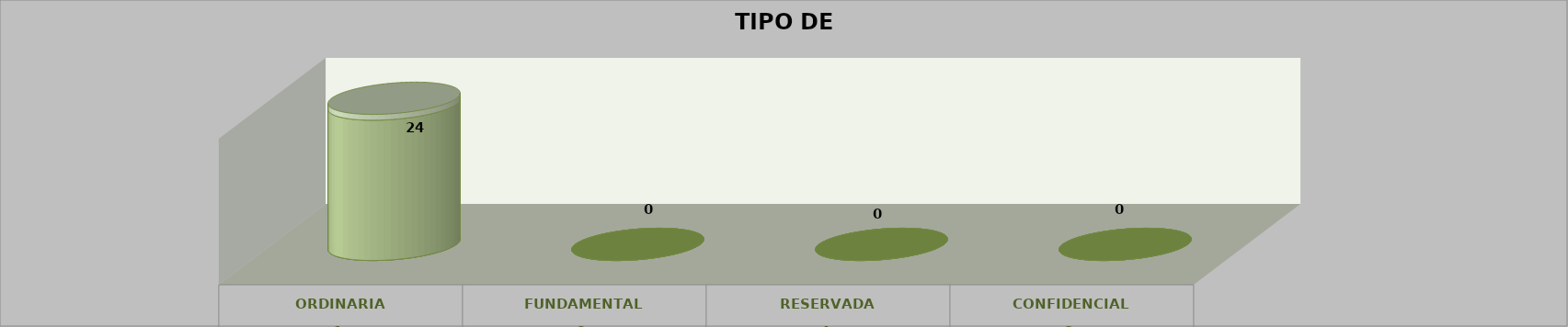
| Category | Series 0 | Series 2 | Series 1 | Series 3 | Series 4 |
|---|---|---|---|---|---|
| 0 |  |  |  | 24 | 1 |
| 1 |  |  |  | 0 | 0 |
| 2 |  |  |  | 0 | 0 |
| 3 |  |  |  | 0 | 0 |